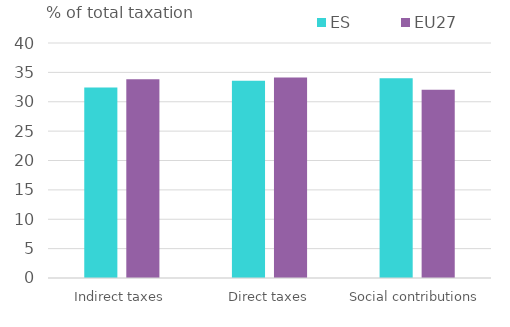
| Category | ES | EU27 |
|---|---|---|
| Indirect taxes | 32.445 | 33.811 |
| Direct taxes | 33.571 | 34.133 |
| Social contributions | 33.984 | 32.056 |